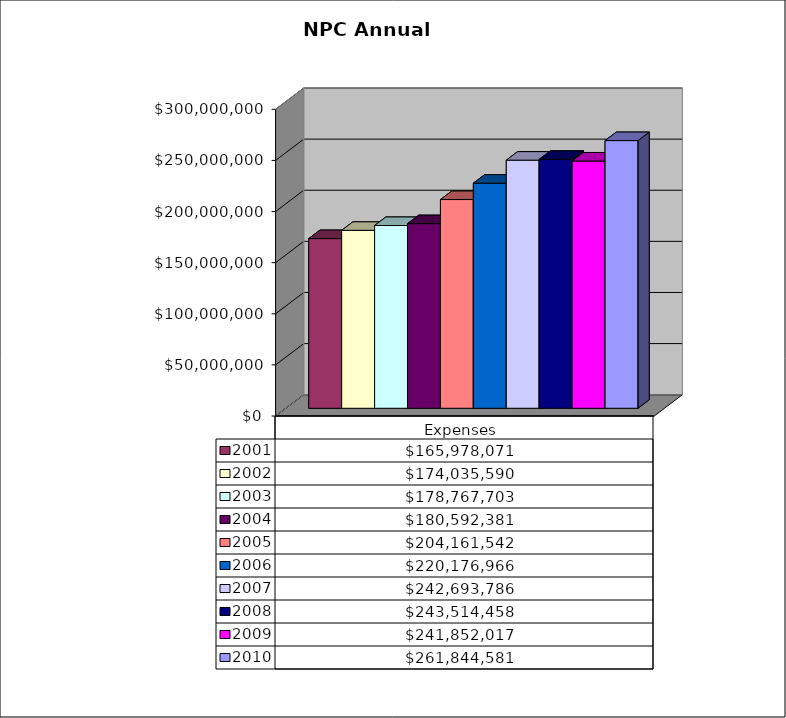
| Category | 2001 | 2002 | 2003 | 2004 | 2005 | 2006 | 2007 | 2008 | 2009 | 2010 |
|---|---|---|---|---|---|---|---|---|---|---|
| Expenses | 165978071 | 174035590 | 178767703 | 180592381 | 204161542 | 220176966 | 242693786 | 243514458 | 241852017 | 261844581 |